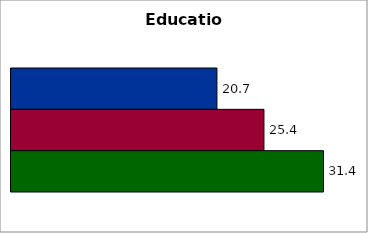
| Category | 50 states and D.C. | SREB states | State |
|---|---|---|---|
| 0 | 20.711 | 25.439 | 31.429 |